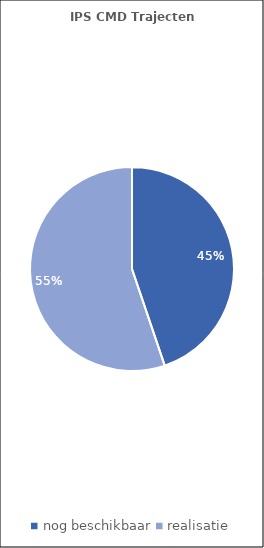
| Category | Series 0 |
|---|---|
| nog beschikbaar | 56 |
| realisatie | 69 |